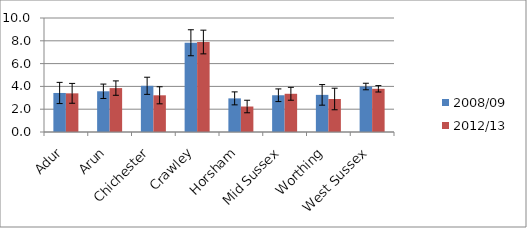
| Category | 2008/09 | 2012/13 |
|---|---|---|
| Adur | 3.424 | 3.391 |
| Arun | 3.571 | 3.852 |
| Chichester | 4.053 | 3.219 |
| Crawley | 7.828 | 7.893 |
| Horsham | 2.95 | 2.235 |
| Mid Sussex | 3.224 | 3.353 |
| Worthing | 3.257 | 2.895 |
| West Sussex | 3.989 | 3.789 |